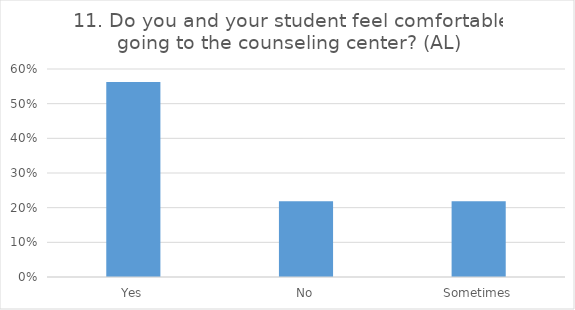
| Category | 11. Do you and your student feel comfortable going to the counseling center? (AL) |
|---|---|
| Yes | 0.562 |
| No | 0.219 |
| Sometimes | 0.219 |